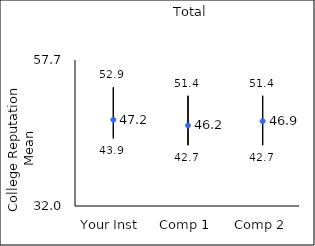
| Category | 25th percentile | 75th percentile | Mean |
|---|---|---|---|
| Your Inst | 43.9 | 52.9 | 47.18 |
| Comp 1 | 42.7 | 51.4 | 46.19 |
| Comp 2 | 42.7 | 51.4 | 46.93 |